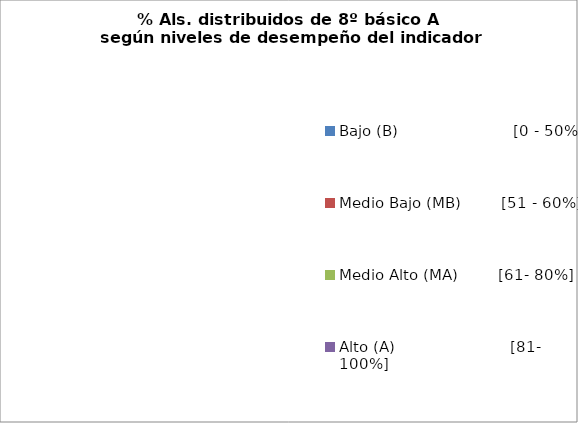
| Category | Series 0 |
|---|---|
| Bajo (B)                       [0 - 50%] | 0 |
| Medio Bajo (MB)        [51 - 60%] | 0 |
| Medio Alto (MA)        [61- 80%] | 0 |
| Alto (A)                       [81- 100%] | 0 |